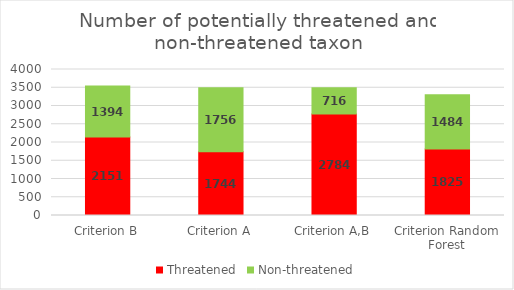
| Category | Threatened | Non-threatened |
|---|---|---|
| Criterion B | 2151 | 1394 |
| Criterion A | 1744 | 1756 |
| Criterion A,B | 2784 | 716 |
| Criterion Random Forest | 1825 | 1484 |